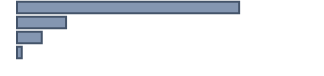
| Category | Series 0 |
|---|---|
| 0 | 73.8 |
| 1 | 16.3 |
| 2 | 8.2 |
| 3 | 1.6 |